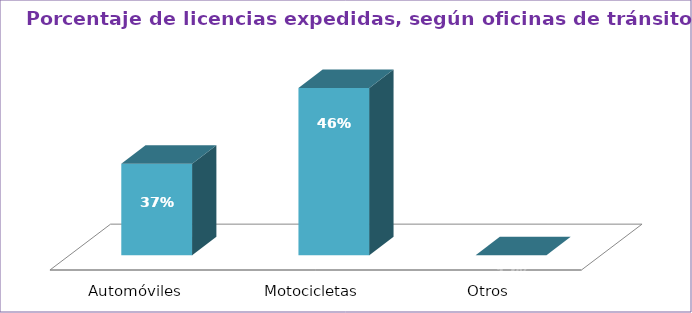
| Category | Series 0 |
|---|---|
| Automóviles  | 35.359 |
| Motocicletas  | 64.641 |
| Otros  | 0 |